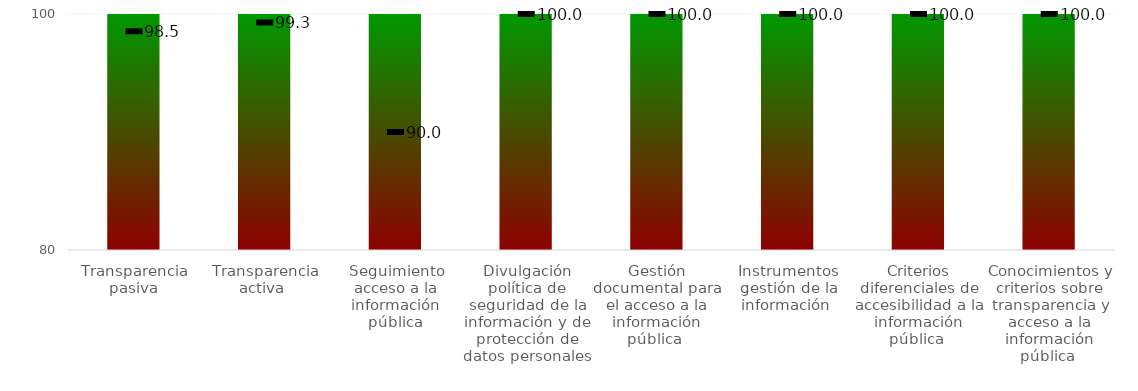
| Category | Niveles |
|---|---|
| Transparencia pasiva | 100 |
| Transparencia activa  | 100 |
| Seguimiento acceso a la información pública | 100 |
| Divulgación política de seguridad de la información y de protección de datos personales | 100 |
| Gestión documental para el acceso a la información pública  | 100 |
| Instrumentos gestión de la información  | 100 |
| Criterios diferenciales de accesibilidad a la información pública  | 100 |
| Conocimientos y criterios sobre transparencia y acceso a la información pública  | 100 |